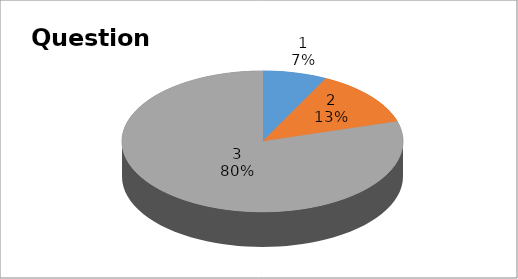
| Category | Series 0 |
|---|---|
| 0 | 4 |
| 1 | 7 |
| 2 | 43 |